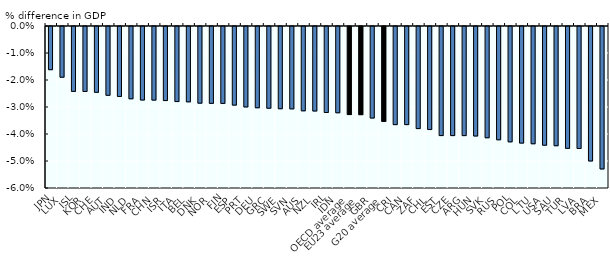
| Category | Series 0 |
|---|---|
| JPN | -0.016 |
| LUX | -0.019 |
| ISL | -0.024 |
| KOR | -0.024 |
| CHE | -0.024 |
| AUT | -0.025 |
| IND | -0.026 |
| NLD | -0.027 |
| FRA | -0.027 |
| CHN | -0.027 |
| ISR | -0.027 |
| ITA | -0.028 |
| BEL | -0.028 |
| DNK | -0.028 |
| NOR | -0.028 |
| FIN | -0.028 |
| ESP | -0.029 |
| PRT | -0.03 |
| DEU | -0.03 |
| GRC | -0.03 |
| SWE | -0.03 |
| SVN | -0.031 |
| AUS | -0.031 |
| NZL | -0.031 |
| IRL | -0.032 |
| IDN | -0.032 |
| OECD average | -0.033 |
| EU23 average | -0.033 |
| GBR | -0.034 |
| G20 average | -0.035 |
| CRI | -0.036 |
| CAN | -0.036 |
| ZAF | -0.038 |
| CHL | -0.038 |
| EST | -0.04 |
| CZE | -0.04 |
| ARG | -0.04 |
| HUN | -0.041 |
| SVK | -0.041 |
| RUS | -0.042 |
| POL | -0.043 |
| COL | -0.043 |
| LTU | -0.043 |
| USA | -0.044 |
| SAU | -0.044 |
| TUR | -0.045 |
| LVA | -0.045 |
| BRA | -0.05 |
| MEX | -0.053 |